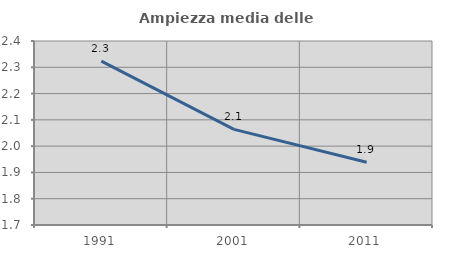
| Category | Ampiezza media delle famiglie |
|---|---|
| 1991.0 | 2.324 |
| 2001.0 | 2.064 |
| 2011.0 | 1.939 |